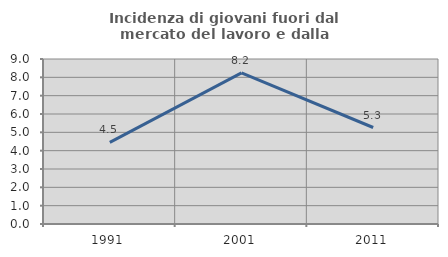
| Category | Incidenza di giovani fuori dal mercato del lavoro e dalla formazione  |
|---|---|
| 1991.0 | 4.455 |
| 2001.0 | 8.244 |
| 2011.0 | 5.263 |